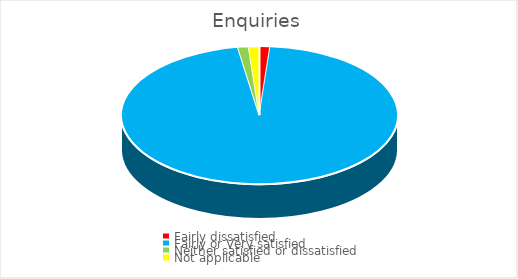
| Category | Series 0 |
|---|---|
| Fairly dissatisfied | 1.25 |
| Fairly or Very satisfied | 96.25 |
| Neither satisfied or dissatisfied | 1.25 |
| Not applicable | 1.25 |